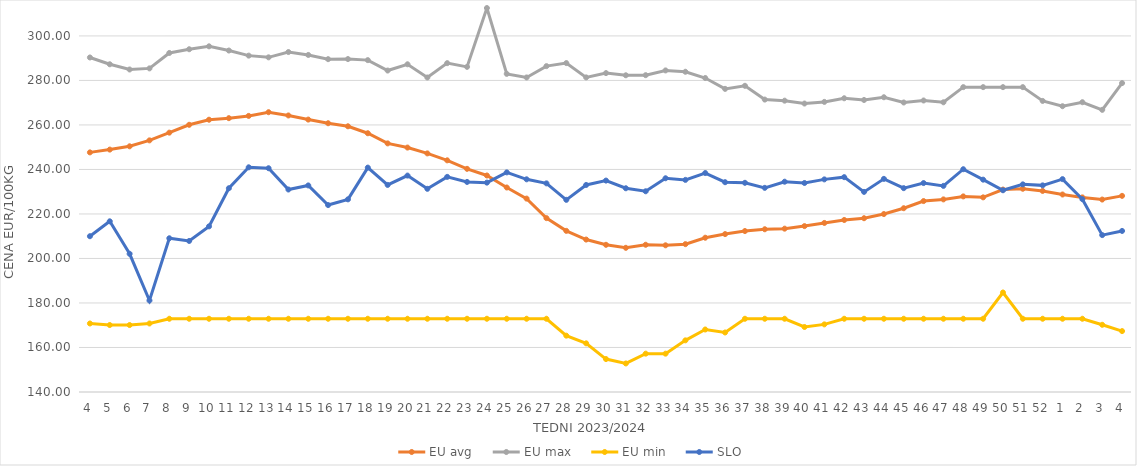
| Category | EU avg | EU max | EU min | SLO |
|---|---|---|---|---|
| 4.0 | 247.672 | 290.32 | 170.79 | 210 |
| 5.0 | 248.924 | 287.27 | 170.09 | 216.7 |
| 6.0 | 250.4 | 284.92 | 170.09 | 202.1 |
| 7.0 | 253.074 | 285.42 | 170.79 | 181.11 |
| 8.0 | 256.543 | 292.35 | 172.91 | 209.08 |
| 9.0 | 260.066 | 294.02 | 172.91 | 207.87 |
| 10.0 | 262.352 | 295.33 | 172.91 | 214.42 |
| 11.0 | 263.049 | 293.44 | 172.91 | 231.56 |
| 12.0 | 264.068 | 291.15 | 172.91 | 240.97 |
| 13.0 | 265.73 | 290.38 | 172.91 | 240.55 |
| 14.0 | 264.262 | 292.763 | 172.91 | 230.99 |
| 15.0 | 262.411 | 291.46 | 172.91 | 232.82 |
| 16.0 | 260.77 | 289.56 | 172.91 | 224 |
| 17.0 | 259.395 | 289.61 | 172.91 | 226.57 |
| 18.0 | 256.275 | 289.13 | 172.91 | 240.83 |
| 19.0 | 251.716 | 284.45 | 172.91 | 233.05 |
| 20.0 | 249.836 | 287.26 | 172.91 | 237.25 |
| 21.0 | 247.212 | 281.33 | 172.91 | 231.3 |
| 22.0 | 244.103 | 287.77 | 172.91 | 236.67 |
| 23.0 | 240.279 | 286.1 | 172.91 | 234.39 |
| 24.0 | 237.289 | 312.54 | 172.91 | 234.08 |
| 25.0 | 231.895 | 282.95 | 172.91 | 238.69 |
| 26.0 | 226.903 | 281.34 | 172.91 | 235.57 |
| 27.0 | 218.126 | 286.43 | 172.91 | 233.75 |
| 28.0 | 212.406 | 287.8 | 165.32 | 226.35 |
| 29.0 | 208.504 | 281.37 | 161.87 | 233.03 |
| 30.0 | 206.149 | 283.3 | 154.8 | 235 |
| 31.0 | 204.79 | 282.32 | 152.83 | 231.55 |
| 32.0 | 206.16 | 282.36 | 157.23 | 230.2 |
| 33.0 | 205.917 | 284.5 | 157.23 | 236.04 |
| 34.0 | 206.436 | 283.9 | 163.21 | 235.32 |
| 35.0 | 209.326 | 281.09 | 168.085 | 238.39 |
| 36.0 | 210.957 | 276.21 | 166.745 | 234.27 |
| 37.0 | 212.325 | 277.59 | 172.91 | 234 |
| 38.0 | 213.132 | 271.4 | 172.91 | 231.74 |
| 39.0 | 213.398 | 270.91 | 172.91 | 234.5 |
| 40.0 | 214.548 | 269.62 | 169.209 | 233.92 |
| 41.0 | 215.966 | 270.36 | 170.387 | 235.54 |
| 42.0 | 217.294 | 271.99 | 172.91 | 236.54 |
| 43.0 | 218.091 | 271.22 | 172.91 | 229.92 |
| 44.0 | 219.965 | 272.45 | 172.91 | 235.77 |
| 45.0 | 222.584 | 270.09 | 172.91 | 231.6 |
| 46.0 | 225.795 | 270.99 | 172.91 | 233.89 |
| 47.0 | 226.547 | 270.18 | 172.91 | 232.62 |
| 48.0 | 227.89 | 276.99 | 172.91 | 240.11 |
| 49.0 | 227.466 | 276.99 | 172.91 | 235.41 |
| 50.0 | 230.959 | 276.99 | 184.72 | 230.65 |
| 51.0 | 231.331 | 276.99 | 172.91 | 233.3 |
| 52.0 | 230.35 | 270.79 | 172.91 | 232.85 |
| 1.0 | 228.749 | 268.42 | 172.91 | 235.66 |
| 2.0 | 227.446 | 270.21 | 172.91 | 226.65 |
| 3.0 | 226.477 | 266.79 | 170.2 | 210.5 |
| 4.0 | 228.135 | 278.81 | 167.37 | 212.37 |